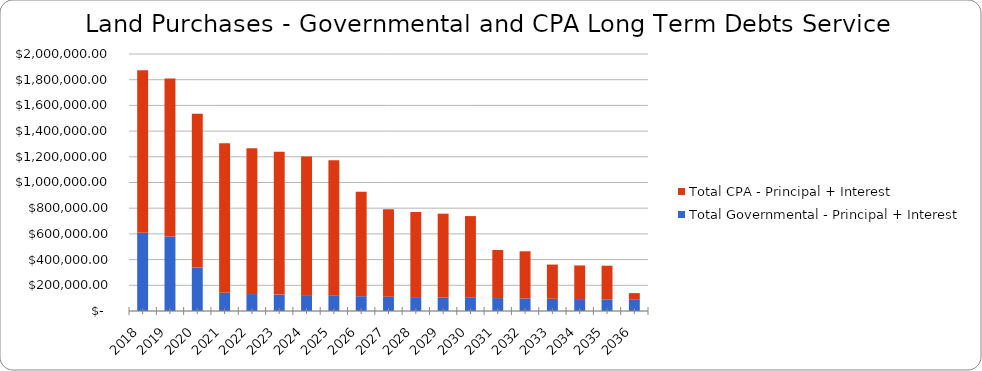
| Category | Total Governmental - Principal + Interest | Total CPA - Principal + Interest |
|---|---|---|
| 2018.0 | 608012.5 | 1266199 |
| 2019.0 | 579662.5 | 1229780 |
| 2020.0 | 337862.5 | 1197299 |
| 2021.0 | 141462.5 | 1163949 |
| 2022.0 | 131962.5 | 1134849 |
| 2023.0 | 127712.5 | 1112161 |
| 2024.0 | 123462.5 | 1078098 |
| 2025.0 | 119212.5 | 1053742 |
| 2026.0 | 114962.5 | 813023 |
| 2027.0 | 110712.5 | 681117 |
| 2028.0 | 108162.5 | 661804 |
| 2029.0 | 105612.5 | 651698 |
| 2030.0 | 103062.5 | 635655 |
| 2031.0 | 100512.5 | 374031 |
| 2032.0 | 97962.5 | 366825 |
| 2033.0 | 95412.5 | 265925 |
| 2034.0 | 92862.5 | 261725 |
| 2035.0 | 90312.5 | 262225 |
| 2036.0 | 87656.26 | 51563 |